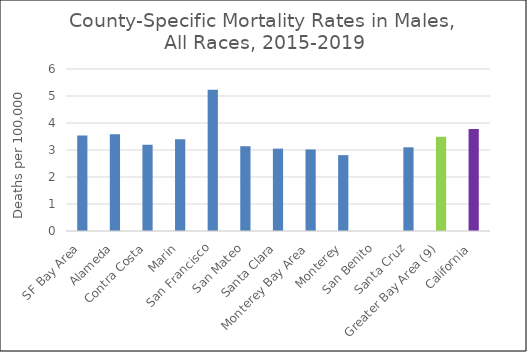
| Category | Male |
|---|---|
| SF Bay Area | 3.54 |
|   Alameda | 3.58 |
|   Contra Costa | 3.19 |
|   Marin | 3.4 |
|   San Francisco | 5.23 |
|   San Mateo | 3.14 |
|   Santa Clara | 3.05 |
| Monterey Bay Area | 3.02 |
|   Monterey | 2.81 |
|   San Benito | 0 |
|   Santa Cruz | 3.1 |
| Greater Bay Area (9) | 3.49 |
| California | 3.78 |